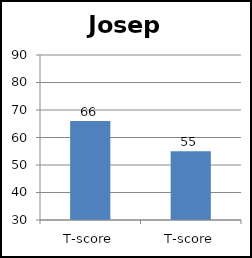
| Category | Joseph |
|---|---|
| T-score | 66 |
| T-score | 55 |